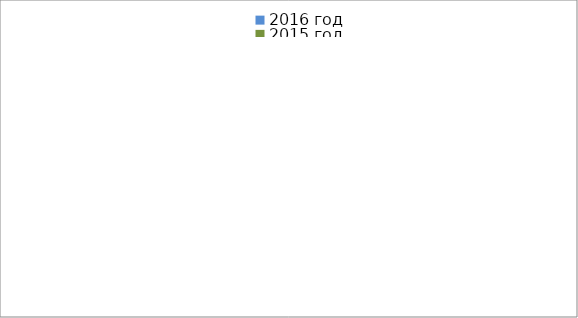
| Category | 2016 год | 2015 год |
|---|---|---|
|  - поджог | 15 | 4 |
|  - неосторожное обращение с огнём | 11 | 15 |
|  - НПТЭ электрооборудования | 2 | 2 |
|  - НПУ и Э печей | 14 | 14 |
|  - НПУ и Э транспортных средств | 8 | 22 |
|   -Шалость с огнем детей | 1 | 0 |
|  -НППБ при эксплуатации эл.приборов | 2 | 6 |
|  - курение | 0 | 5 |
| - прочие | 26 | 30 |
| - не установленные причины | 7 | 2 |